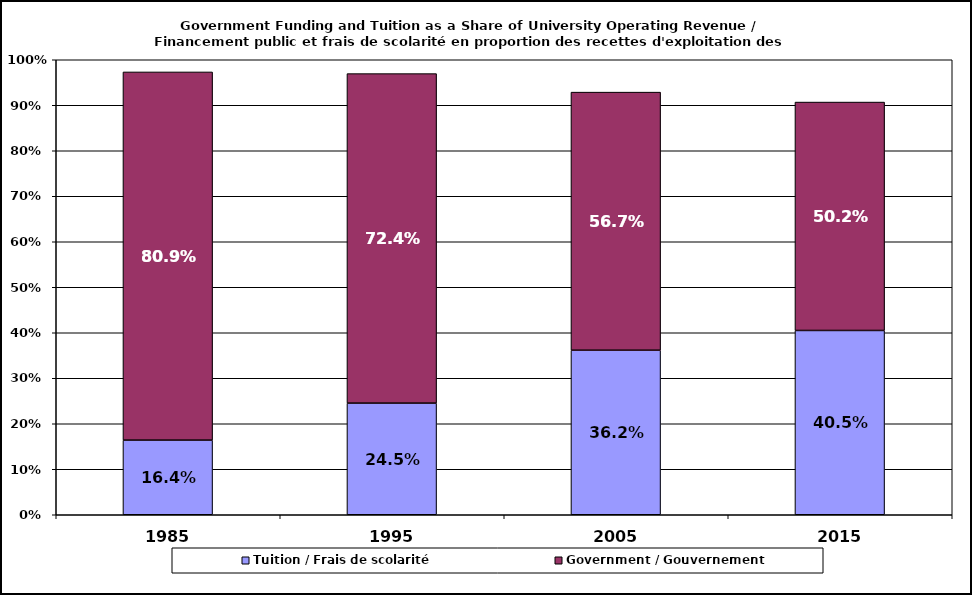
| Category | Tuition / Frais de scolarité | Government / Gouvernement |
|---|---|---|
| 1985.0 | 0.164 | 0.809 |
| 1995.0 | 0.245 | 0.724 |
| 2005.0 | 0.362 | 0.567 |
| 2015.0 | 0.405 | 0.502 |